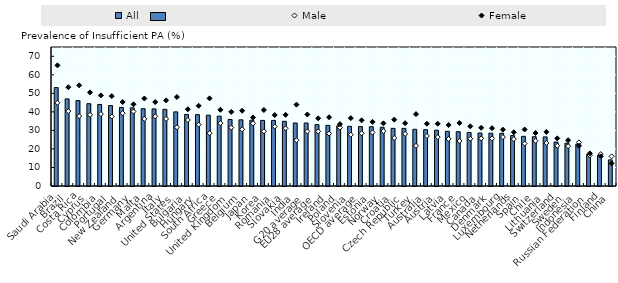
| Category | All |
|---|---|
| Saudi Arabia | 53.1 |
| Brazil | 47 |
| Costa Rica | 46.1 |
| Cyprus | 44.4 |
| Colombia | 44 |
| Portugal | 43.4 |
| New Zealand | 42.4 |
| Germany | 42.2 |
| Malta | 41.7 |
| Argentina | 41.6 |
| Italy | 41.4 |
| United States | 40 |
| Bulgaria | 38.6 |
| Hungary | 38.5 |
| South Africa | 38.2 |
| Greece | 37.7 |
| United Kingdom | 35.9 |
| Belgium | 35.7 |
| Japan | 35.5 |
| Korea | 35.4 |
| Romania | 35.4 |
| Slovakia | 34.9 |
| India | 34 |
| G20 average | 33.995 |
| EU28 average | 33.121 |
| Ireland | 32.7 |
| Poland | 32.5 |
| Slovenia | 32.2 |
| OECD average | 32.059 |
| Estonia | 32 |
| Norway | 31.7 |
| Croatia | 31.1 |
| Czech Republic | 31.1 |
| Turkey | 30.6 |
| Australia | 30.4 |
| Austria | 30.1 |
| Latvia | 29.5 |
| France | 29.3 |
| Mexico | 28.9 |
| Canada | 28.6 |
| Denmark | 28.5 |
| Luxembourg | 28.4 |
| Netherlands | 27.2 |
| Spain | 26.8 |
| Chile | 26.6 |
| Lithuania | 26.5 |
| Switzerland | 23.7 |
| Sweden | 23.1 |
| Indonesia | 22.6 |
| Russian Federation | 17.1 |
| Finland | 16.6 |
| China | 14.1 |